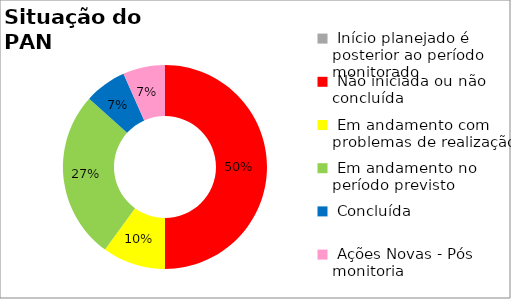
| Category | Series 0 |
|---|---|
|  Início planejado é posterior ao período monitorado | 0 |
|  Não iniciada ou não concluída | 0.5 |
|  Em andamento com problemas de realização | 0.1 |
|  Em andamento no período previsto  | 0.267 |
|  Concluída | 0.067 |
|  Ações Novas - Pós monitoria | 0.067 |